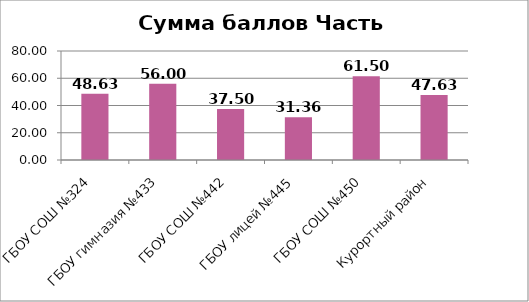
| Category | Сумма баллов Часть 1 |
|---|---|
| ГБОУ СОШ №324 | 48.626 |
| ГБОУ гимназия №433 | 56 |
| ГБОУ СОШ №442 | 37.5 |
| ГБОУ лицей №445 | 31.364 |
| ГБОУ СОШ №450 | 61.497 |
| Курортный район | 47.633 |